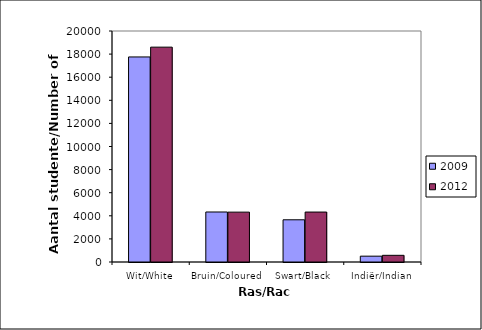
| Category | 2009 | 2012 |
|---|---|---|
| Wit/White | 17753 | 18602 |
| Bruin/Coloured | 4330 | 4318 |
| Swart/Black | 3655 | 4324 |
| Indiër/Indian | 505 | 579 |